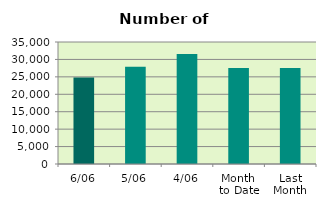
| Category | Series 0 |
|---|---|
| 6/06 | 24796 |
| 5/06 | 27902 |
| 4/06 | 31538 |
| Month 
to Date | 27517 |
| Last
Month | 27522.455 |